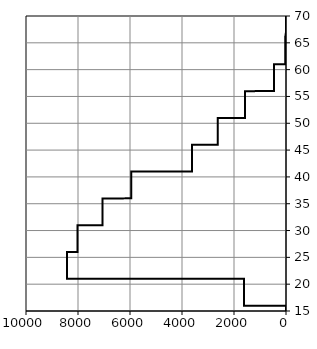
| Category | Hommes |
|---|---|
| 0.0 | 15 |
| 0.0 | 15.99 |
| -1611.8 | 16 |
| -1611.8 | 17 |
| -1611.8 | 18 |
| -1611.8 | 19 |
| -1611.8 | 20.99 |
| -8419.6 | 21 |
| -8419.6 | 22 |
| -8419.6 | 23 |
| -8419.6 | 24 |
| -8419.6 | 25.99 |
| -8023.2 | 26 |
| -8023.2 | 27 |
| -8023.2 | 28 |
| -8023.2 | 29 |
| -8023.2 | 30.99 |
| -7057.0 | 31 |
| -7057.0 | 32 |
| -7057.0 | 33 |
| -7057.0 | 34 |
| -7057.0 | 35.99 |
| -5954.4 | 36 |
| -5954.4 | 37 |
| -5954.4 | 38 |
| -5954.4 | 39 |
| -5954.4 | 40.99 |
| -3614.2 | 41 |
| -3614.2 | 42 |
| -3614.2 | 43 |
| -3614.2 | 44 |
| -3614.2 | 45.99 |
| -2626.8 | 46 |
| -2626.8 | 47 |
| -2626.8 | 48 |
| -2626.8 | 49 |
| -2626.8 | 50.99 |
| -1578.8 | 51 |
| -1578.8 | 52 |
| -1578.8 | 53 |
| -1578.8 | 54 |
| -1578.8 | 55.99 |
| -464.2 | 56 |
| -464.2 | 57 |
| -464.2 | 58 |
| -464.2 | 59 |
| -464.2 | 60.99 |
| -32.8 | 61 |
| -32.8 | 62 |
| -32.8 | 63 |
| -32.8 | 64 |
| -32.8 | 65.99 |
| 0.0 | 66 |
| 0.0 | 67 |
| 0.0 | 68 |
| 0.0 | 69 |
| 0.0 | 70 |